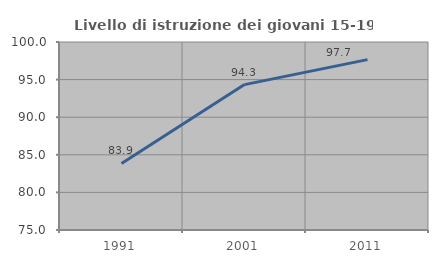
| Category | Livello di istruzione dei giovani 15-19 anni |
|---|---|
| 1991.0 | 83.85 |
| 2001.0 | 94.335 |
| 2011.0 | 97.655 |